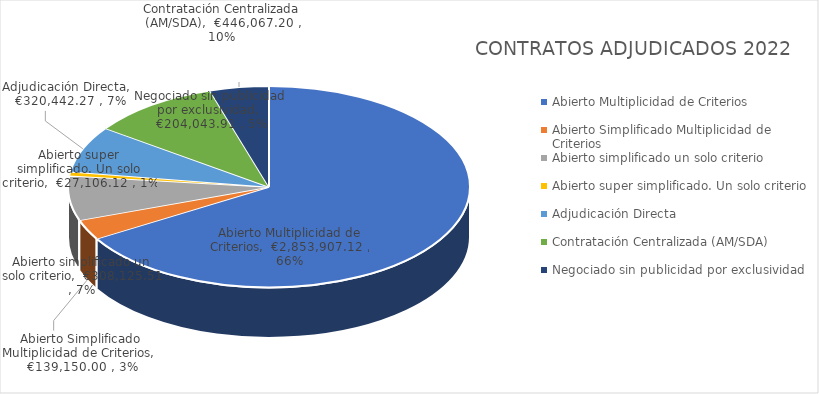
| Category | Total |
|---|---|
| Abierto Multiplicidad de Criterios | 2853907.12 |
| Abierto Simplificado Multiplicidad de Criterios | 139150 |
| Abierto simplificado un solo criterio | 308125.51 |
| Abierto super simplificado. Un solo criterio | 27106.12 |
| Adjudicación Directa | 320442.27 |
| Contratación Centralizada (AM/SDA) | 446067.2 |
| Negociado sin publicidad por exclusividad | 204043.91 |